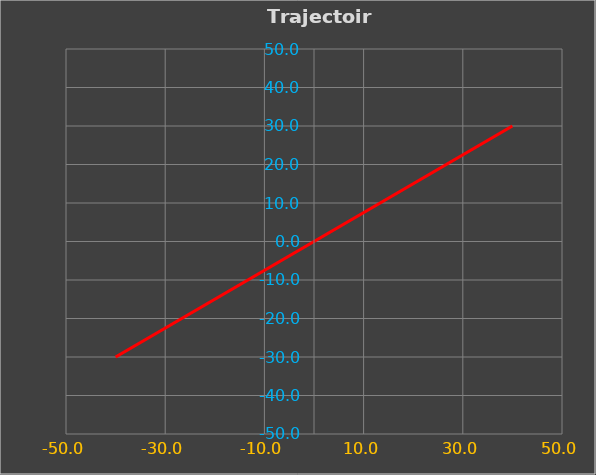
| Category | y(t) en mm |
|---|---|
| 0.0 | 0 |
| 6.2573786016092345 | 4.693 |
| 12.360679774997896 | 9.271 |
| 18.15961998958187 | 13.62 |
| 23.511410091698927 | 17.634 |
| 28.2842712474619 | 21.213 |
| 32.36067977499789 | 24.271 |
| 35.640260967534715 | 26.73 |
| 38.04226065180614 | 28.532 |
| 39.507533623805514 | 29.631 |
| 40.0 | 30 |
| 39.507533623805514 | 29.631 |
| 38.042260651806146 | 28.532 |
| 35.640260967534715 | 26.73 |
| 32.36067977499791 | 24.271 |
| 28.284271247461916 | 21.213 |
| 23.51141009169893 | 17.634 |
| 18.159619989581874 | 13.62 |
| 12.3606797749979 | 9.271 |
| 6.257378601609239 | 4.693 |
| 2.2664162213636985e-14 | 0 |
| -6.257378601609212 | -4.693 |
| -12.360679774997891 | -9.271 |
| -18.15961998958185 | -13.62 |
| -23.511410091698906 | -17.634 |
| -28.2842712474619 | -21.213 |
| -32.36067977499789 | -24.271 |
| -35.640260967534715 | -26.73 |
| -38.04226065180613 | -28.532 |
| -39.50753362380551 | -29.631 |
| -40.0 | -30 |
| -39.507533623805514 | -29.631 |
| -38.042260651806146 | -28.532 |
| -35.640260967534736 | -26.73 |
| -32.360679774997905 | -24.271 |
| -28.284271247461934 | -21.213 |
| -23.511410091698934 | -17.634 |
| -18.159619989581877 | -13.62 |
| -12.360679774997905 | -9.271 |
| -6.257378601609279 | -4.693 |
| -4.532832442727397e-14 | 0 |
| 6.257378601609189 | 4.693 |
| 12.360679774997854 | 9.271 |
| 18.15961998958183 | 13.62 |
| 23.511410091698917 | 17.634 |
| 28.284271247461895 | 21.213 |
| 32.36067977499787 | 24.271 |
| 35.64026096753471 | 26.73 |
| 38.04226065180613 | 28.532 |
| 39.50753362380551 | 29.631 |
| 40.0 | 30 |
| 39.507533623805514 | 29.631 |
| 38.042260651806146 | 28.532 |
| 35.640260967534736 | 26.73 |
| 32.360679774997905 | 24.271 |
| 28.284271247461934 | 21.213 |
| 23.51141009169899 | 17.634 |
| 18.159619989581916 | 13.62 |
| 12.360679774997912 | 9.271 |
| 6.257378601609213 | 4.693 |
| 8.575605503491346e-14 | 0 |
| -6.257378601609115 | -4.693 |
| -12.360679774997882 | -9.271 |
| -18.159619989581827 | -13.62 |
| -23.511410091698913 | -17.634 |
| -28.284271247461863 | -21.213 |
| -32.36067977499785 | -24.271 |
| -35.64026096753472 | -26.73 |
| -38.04226065180614 | -28.532 |
| -39.5075336238055 | -29.631 |
| -40.0 | -30 |
| -39.50753362380553 | -29.631 |
| -38.04226065180615 | -28.532 |
| -35.640260967534736 | -26.73 |
| -32.360679774997905 | -24.271 |
| -28.284271247461938 | -21.213 |
| -23.511410091698938 | -17.634 |
| -18.15961998958192 | -13.62 |
| -12.360679774997983 | -9.271 |
| -6.25737860160929 | -4.693 |
| -9.065664885454794e-14 | 0 |
| 6.25737860160918 | 4.693 |
| 12.36067977499781 | 9.271 |
| 18.15961998958182 | 13.62 |
| 23.51141009169885 | 17.634 |
| 28.284271247461863 | 21.213 |
| 32.36067977499785 | 24.271 |
| 35.64026096753466 | 26.73 |
| 38.04226065180614 | 28.532 |
| 39.5075336238055 | 29.631 |
| 40.0 | 30 |
| 39.50753362380552 | 29.631 |
| 38.042260651806174 | 28.532 |
| 35.64026096753474 | 26.73 |
| 32.36067977499791 | 24.271 |
| 28.284271247461945 | 21.213 |
| 23.511410091699002 | 17.634 |
| 18.159619989581987 | 13.62 |
| 12.36067977499792 | 9.271 |
| 6.257378601609224 | 4.693 |
| 2.45029690981724e-14 | 0 |